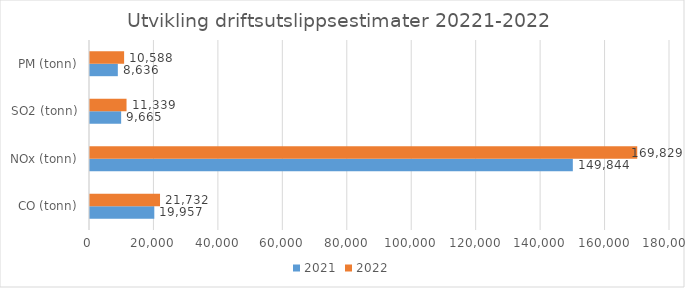
| Category | 2021 | 2022 |
|---|---|---|
| CO (tonn) | 19957.07 | 21732.45 |
| NOx (tonn) | 149843.77 | 169829.17 |
| SO2 (tonn) | 9665 | 11338.56 |
| PM (tonn) | 8635.62 | 10587.79 |